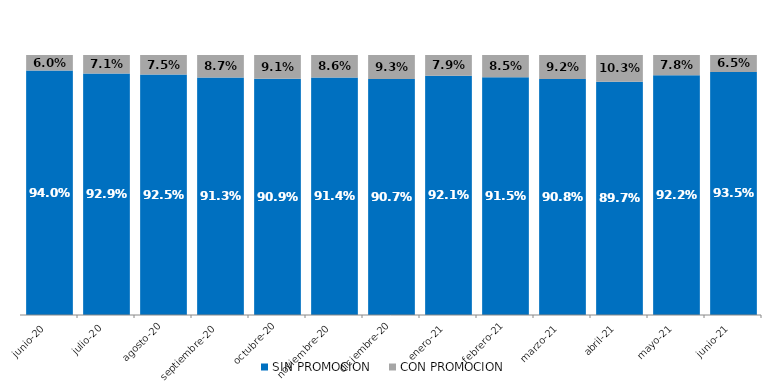
| Category | SIN PROMOCION   | CON PROMOCION   |
|---|---|---|
| 2020-06-01 | 0.94 | 0.06 |
| 2020-07-01 | 0.929 | 0.071 |
| 2020-08-01 | 0.925 | 0.075 |
| 2020-09-01 | 0.913 | 0.087 |
| 2020-10-01 | 0.909 | 0.091 |
| 2020-11-01 | 0.914 | 0.086 |
| 2020-12-01 | 0.907 | 0.093 |
| 2021-01-01 | 0.921 | 0.079 |
| 2021-02-01 | 0.915 | 0.085 |
| 2021-03-01 | 0.908 | 0.092 |
| 2021-04-01 | 0.897 | 0.103 |
| 2021-05-01 | 0.922 | 0.078 |
| 2021-06-01 | 0.935 | 0.065 |